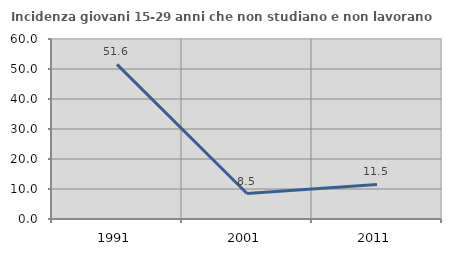
| Category | Incidenza giovani 15-29 anni che non studiano e non lavorano  |
|---|---|
| 1991.0 | 51.557 |
| 2001.0 | 8.48 |
| 2011.0 | 11.525 |